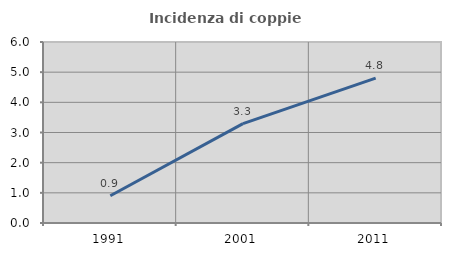
| Category | Incidenza di coppie miste |
|---|---|
| 1991.0 | 0.902 |
| 2001.0 | 3.294 |
| 2011.0 | 4.8 |